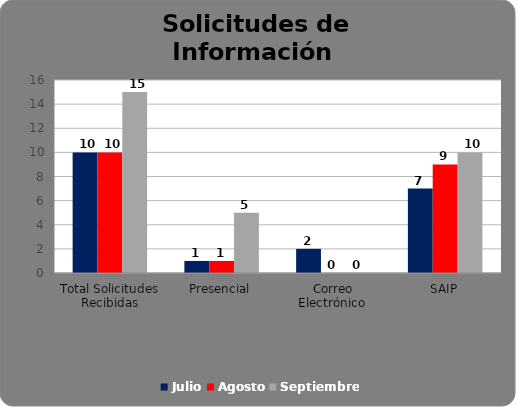
| Category | Julio | Agosto | Septiembre |
|---|---|---|---|
| Total Solicitudes Recibidas | 10 | 10 | 15 |
| Presencial | 1 | 1 | 5 |
| Correo Electrónico  | 2 | 0 | 0 |
| SAIP | 7 | 9 | 10 |